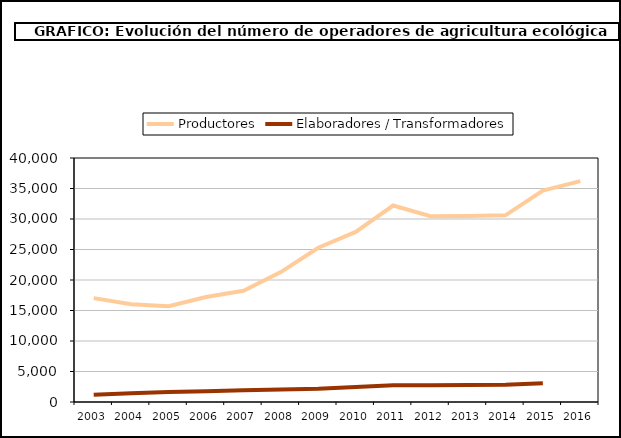
| Category | Productores | Elaboradores / Transformadores |
|---|---|---|
| 2003.0 | 17028 |  |
| 2004.0 | 16013 |  |
| 2005.0 | 15693 |  |
| 2006.0 | 17214 |  |
| 2007.0 | 18226 |  |
| 2008.0 | 21291 |  |
| 2009.0 | 25291 |  |
| 2010.0 | 27877 |  |
| 2011.0 | 32206 |  |
| 2012.0 | 30462 |  |
| 2013.0 | 30502 |  |
| 2014.0 | 30602 |  |
| 2015.0 | 34673 |  |
| 2016.0 | 36207 |  |